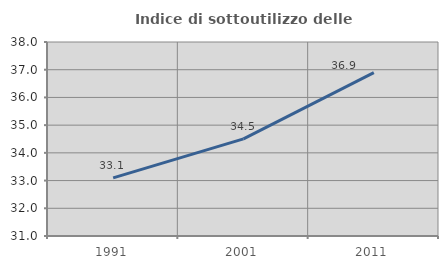
| Category | Indice di sottoutilizzo delle abitazioni  |
|---|---|
| 1991.0 | 33.099 |
| 2001.0 | 34.505 |
| 2011.0 | 36.893 |